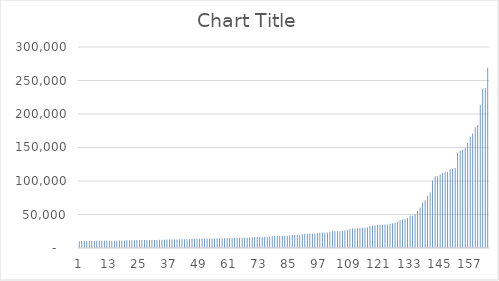
| Category | Series 0 |
|---|---|
| 0 | 10103 |
| 1 | 10267 |
| 2 | 10314 |
| 3 | 10495 |
| 4 | 10508 |
| 5 | 10544 |
| 6 | 10566 |
| 7 | 10733 |
| 8 | 10755 |
| 9 | 10770 |
| 10 | 10788 |
| 11 | 10821 |
| 12 | 10845 |
| 13 | 10855 |
| 14 | 10990 |
| 15 | 11007 |
| 16 | 11009 |
| 17 | 11188 |
| 18 | 11335 |
| 19 | 11472 |
| 20 | 11497 |
| 21 | 11574 |
| 22 | 11595 |
| 23 | 11795 |
| 24 | 11806 |
| 25 | 11839 |
| 26 | 11924 |
| 27 | 11924 |
| 28 | 11941 |
| 29 | 12077 |
| 30 | 12080 |
| 31 | 12085 |
| 32 | 12354 |
| 33 | 12354 |
| 34 | 12422 |
| 35 | 12650 |
| 36 | 12652 |
| 37 | 12687 |
| 38 | 12692 |
| 39 | 12828 |
| 40 | 12974 |
| 41 | 13017 |
| 42 | 13053 |
| 43 | 13113 |
| 44 | 13239 |
| 45 | 13711 |
| 46 | 13750 |
| 47 | 13897 |
| 48 | 13917 |
| 49 | 14040 |
| 50 | 14257 |
| 51 | 14277 |
| 52 | 14292 |
| 53 | 14329 |
| 54 | 14352 |
| 55 | 14401 |
| 56 | 14438 |
| 57 | 14531 |
| 58 | 14631 |
| 59 | 14753 |
| 60 | 14770 |
| 61 | 14841 |
| 62 | 15151 |
| 63 | 15155 |
| 64 | 15211 |
| 65 | 15231 |
| 66 | 15262 |
| 67 | 15449 |
| 68 | 15678 |
| 69 | 16013 |
| 70 | 16299 |
| 71 | 16445 |
| 72 | 16487 |
| 73 | 16539 |
| 74 | 16902 |
| 75 | 16972 |
| 76 | 17214 |
| 77 | 17534 |
| 78 | 17752 |
| 79 | 17965 |
| 80 | 17992 |
| 81 | 18117 |
| 82 | 18260 |
| 83 | 18435 |
| 84 | 18795 |
| 85 | 19351 |
| 86 | 19542 |
| 87 | 19653 |
| 88 | 19833 |
| 89 | 20548 |
| 90 | 20768 |
| 91 | 21012 |
| 92 | 21226 |
| 93 | 21337 |
| 94 | 21799 |
| 95 | 22543 |
| 96 | 22809 |
| 97 | 23035 |
| 98 | 23218 |
| 99 | 23297 |
| 100 | 24324 |
| 101 | 24941 |
| 102 | 25167 |
| 103 | 25372 |
| 104 | 25402 |
| 105 | 25638 |
| 106 | 26254 |
| 107 | 26711 |
| 108 | 28218 |
| 109 | 29137 |
| 110 | 29167 |
| 111 | 29635 |
| 112 | 29843 |
| 113 | 30257 |
| 114 | 30349 |
| 115 | 30700 |
| 116 | 33179 |
| 117 | 33318 |
| 118 | 34084 |
| 119 | 34583 |
| 120 | 34671 |
| 121 | 34834 |
| 122 | 34972 |
| 123 | 35203 |
| 124 | 36306 |
| 125 | 36936 |
| 126 | 37618 |
| 127 | 38883 |
| 128 | 41431 |
| 129 | 42472 |
| 130 | 42843 |
| 131 | 44838 |
| 132 | 48176 |
| 133 | 48248 |
| 134 | 50414 |
| 135 | 55153 |
| 136 | 60447 |
| 137 | 67960 |
| 138 | 71178 |
| 139 | 78034 |
| 140 | 82779 |
| 141 | 100751 |
| 142 | 106931 |
| 143 | 107145 |
| 144 | 109554 |
| 145 | 112026 |
| 146 | 113285 |
| 147 | 113614 |
| 148 | 117714 |
| 149 | 118033 |
| 150 | 119588 |
| 151 | 141837 |
| 152 | 145117 |
| 153 | 146730 |
| 154 | 149138 |
| 155 | 156834 |
| 156 | 165934 |
| 157 | 170982 |
| 158 | 180176 |
| 159 | 183516 |
| 160 | 213625 |
| 161 | 237136 |
| 162 | 238767 |
| 163 | 269159 |